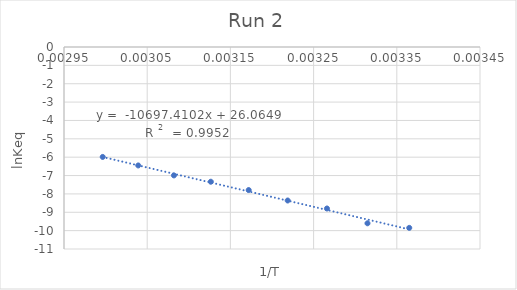
| Category | Series 0 |
|---|---|
| 0.003364963994885255 | -9.849 |
| 0.003314770617873243 | -9.6 |
| 0.0032660526487686982 | -8.794 |
| 0.0032188495831589788 | -8.359 |
| 0.003171985028230667 | -7.79 |
| 0.0031264655307175235 | -7.337 |
| 0.0030821390044691015 | -6.992 |
| 0.0030392365437802026 | -6.45 |
| 0.002996524032122737 | -5.986 |